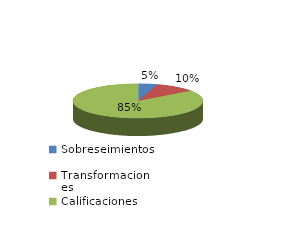
| Category | Series 0 |
|---|---|
| Sobreseimientos | 30 |
| Transformaciones | 62 |
| Calificaciones | 526 |